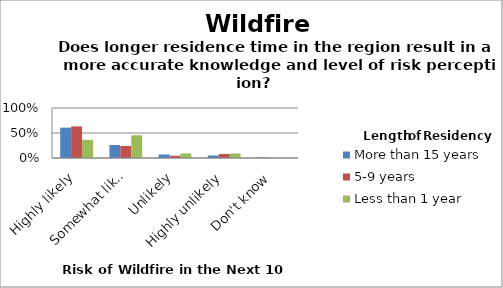
| Category | More than 15 years | 5-9 years | Less than 1 year |
|---|---|---|---|
| Highly likely | 0.607 | 0.632 | 0.364 |
| Somewhat likely | 0.259 | 0.241 | 0.455 |
| Unlikely | 0.071 | 0.046 | 0.091 |
| Highly unlikely | 0.05 | 0.08 | 0.091 |
| Don't know | 0.013 | 0 | 0 |